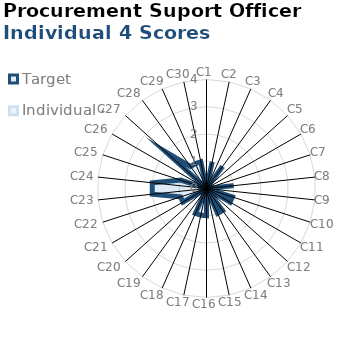
| Category | Target | Individual 4 |
|---|---|---|
| C1 | 0 | 0 |
| C2 | 1 | 0 |
| C3 | 0 | 0 |
| C4 | 1 | 0 |
| C5 | 0 | 0 |
| C6 | 0 | 0 |
| C7 | 0 | 0 |
| C8 | 1 | 0 |
| C9 | 0 | 0 |
| C10 | 1 | 0 |
| C11 | 1 | 0 |
| C12 | 0 | 0 |
| C13 | 1 | 0 |
| C14 | 1 | 0 |
| C15 | 0 | 0 |
| C16 | 1 | 0 |
| C17 | 1 | 0 |
| C18 | 1 | 0 |
| C19 | 0 | 0 |
| C20 | 0 | 0 |
| C21 | 1 | 0 |
| C22 | 1 | 0 |
| C23 | 2 | 0 |
| C24 | 2 | 0 |
| C25 | 1 | 0 |
| C26 | 0 | 0 |
| C27 | 2 | 0 |
| C28 | 1 | 0 |
| C29 | 1 | 0 |
| C30 | 1 | 0 |